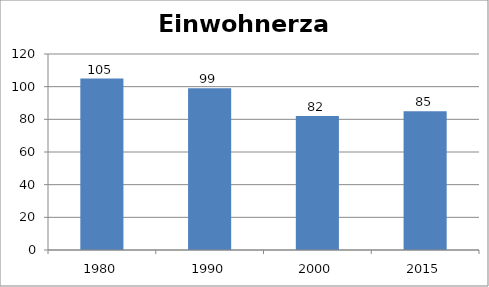
| Category | Einwohnerzahl |
|---|---|
| 1980.0 | 105 |
| 1990.0 | 99 |
| 2000.0 | 82 |
| 2015.0 | 85 |